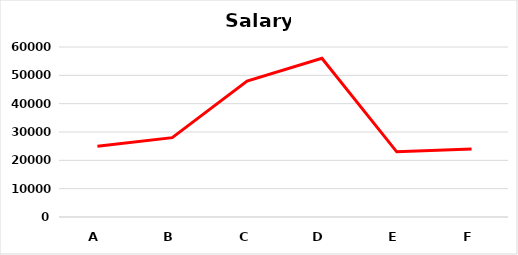
| Category | Salary |
|---|---|
| A | 25000 |
| B | 28000 |
| C | 48000 |
| D | 56000 |
| E | 23000 |
| F | 24000 |